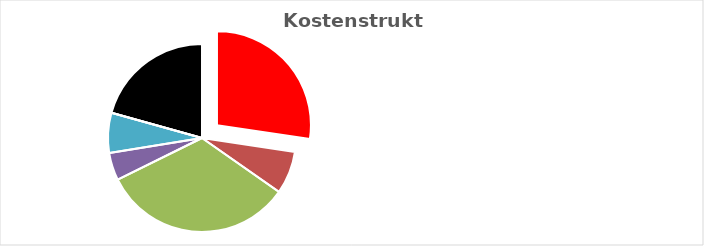
| Category | Series 0 |
|---|---|
| KV-Entgelt produktiv Tätige | 1 |
| Weitere Personalkosten produktiv | 0.268 |
| Personalnebenkosten | 1.205 |
| Unproduktives Personal | 0.174 |
| Deckung Personalgemeinkosten | 0.252 |
| Umlagen ohne GZ | 0 |
| Gesamtzuschlag | 0.755 |